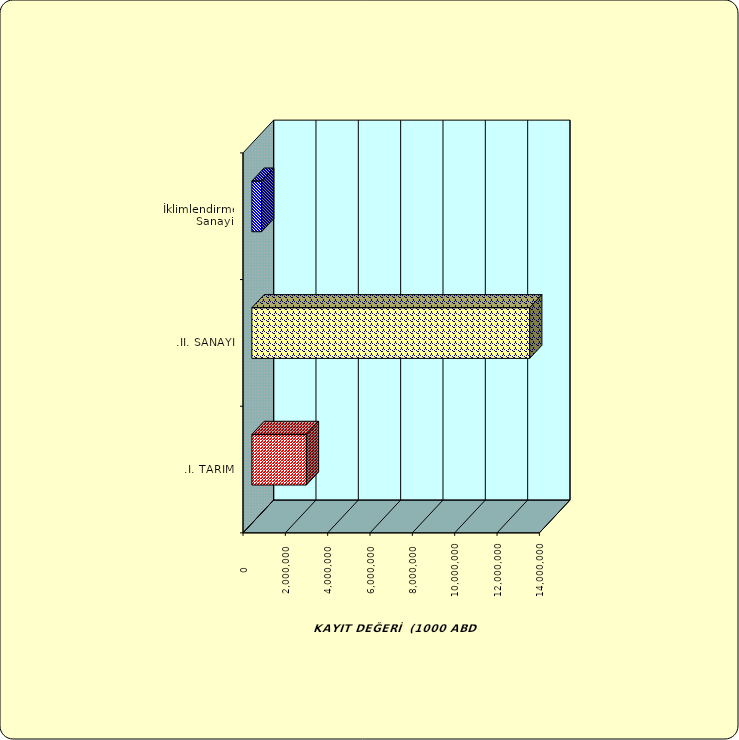
| Category | Series 0 |
|---|---|
| .I. TARIM | 2574916.888 |
| .II. SANAYİ | 13122558.073 |
|  İklimlendirme Sanayii | 458579.59 |